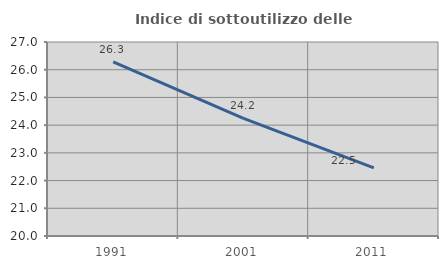
| Category | Indice di sottoutilizzo delle abitazioni  |
|---|---|
| 1991.0 | 26.286 |
| 2001.0 | 24.242 |
| 2011.0 | 22.46 |